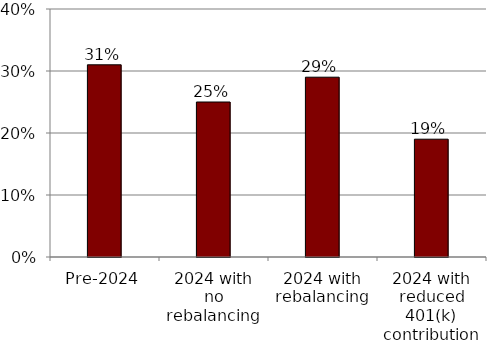
| Category | Series 0 |
|---|---|
| Pre-2024 | 0.31 |
| 2024 with no rebalancing | 0.25 |
| 2024 with rebalancing | 0.29 |
| 2024 with reduced 401(k) contribution | 0.19 |